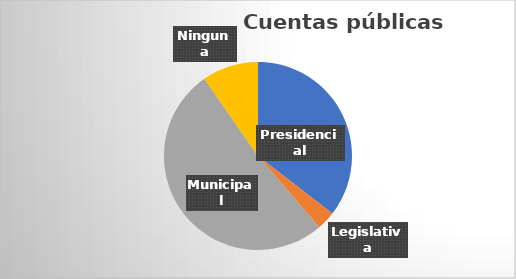
| Category | Series 0 |
|---|---|
| Presidencial | 11 |
| Legislativa | 1 |
| Municipal | 16 |
| Ninguna | 3 |